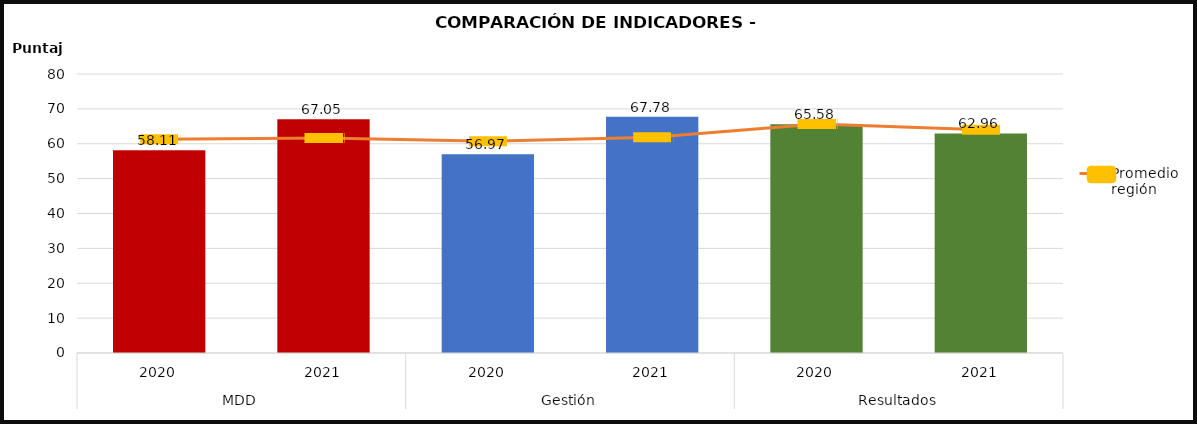
| Category | Datos mpio |
|---|---|
| 0 | 58.111 |
| 1 | 67.051 |
| 2 | 56.973 |
| 3 | 67.776 |
| 4 | 65.585 |
| 5 | 62.956 |